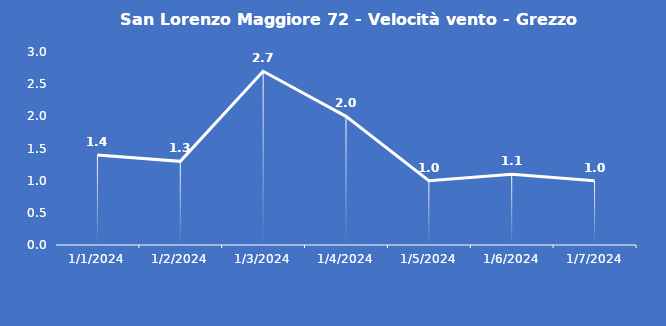
| Category | San Lorenzo Maggiore 72 - Velocità vento - Grezzo (m/s) |
|---|---|
| 1/1/24 | 1.4 |
| 1/2/24 | 1.3 |
| 1/3/24 | 2.7 |
| 1/4/24 | 2 |
| 1/5/24 | 1 |
| 1/6/24 | 1.1 |
| 1/7/24 | 1 |